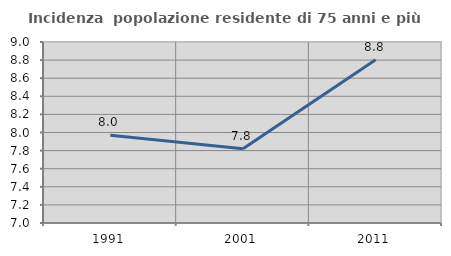
| Category | Incidenza  popolazione residente di 75 anni e più |
|---|---|
| 1991.0 | 7.97 |
| 2001.0 | 7.822 |
| 2011.0 | 8.805 |